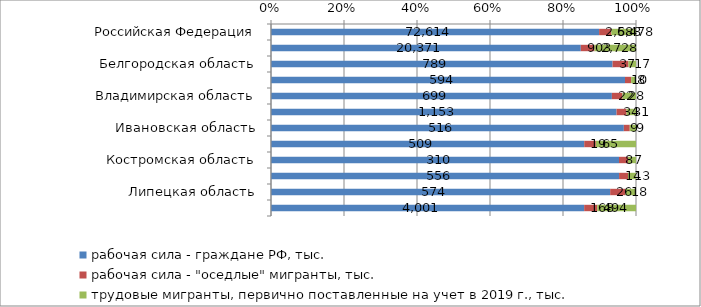
| Category |  рабочая сила - граждане РФ, тыс.  |  рабочая сила - "оседлые" мигранты, тыс.   |  трудовые мигранты, первично поставленные на учет в 2019 г., тыс.  |
|---|---|---|---|
| Российская Федерация | 72614.204 | 2688.08 | 5478.249 |
| Центральный федеральный округ | 20370.747 | 903.15 | 2727.812 |
| Белгородская область | 789.136 | 36.857 | 17.333 |
| Брянская область | 594.492 | 10.328 | 8.133 |
| Владимирская область | 699.279 | 21.677 | 27.793 |
| Воронежская область | 1153.434 | 33.515 | 31.477 |
| Ивановская область | 515.8 | 8.66 | 9.121 |
| Калужская область | 508.807 | 18.897 | 65.203 |
| Костромская область | 310.041 | 8.028 | 7.107 |
| Курская область | 555.524 | 14.274 | 12.718 |
| Липецкая область | 574.21 | 25.734 | 17.991 |
| Московская область | 4001.32 | 168.423 | 493.878 |